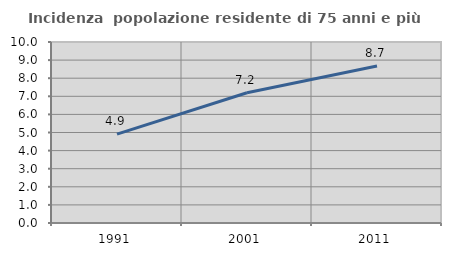
| Category | Incidenza  popolazione residente di 75 anni e più |
|---|---|
| 1991.0 | 4.909 |
| 2001.0 | 7.198 |
| 2011.0 | 8.672 |